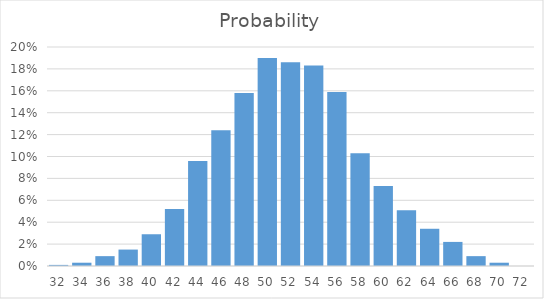
| Category | Series 0 |
|---|---|
| 32.0 | 0.001 |
| 34.0 | 0.003 |
| 36.0 | 0.009 |
| 38.0 | 0.015 |
| 40.0 | 0.029 |
| 42.0 | 0.052 |
| 44.0 | 0.096 |
| 46.0 | 0.124 |
| 48.0 | 0.158 |
| 50.0 | 0.19 |
| 52.0 | 0.186 |
| 54.0 | 0.183 |
| 56.0 | 0.159 |
| 58.0 | 0.103 |
| 60.0 | 0.073 |
| 62.0 | 0.051 |
| 64.0 | 0.034 |
| 66.0 | 0.022 |
| 68.0 | 0.009 |
| 70.0 | 0.003 |
| 72.0 | 0 |